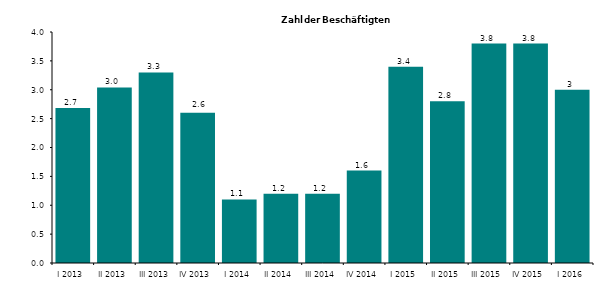
| Category | Series 0 |
|---|---|
| I 2013 | 2.682 |
| II 2013 | 3.039 |
| III 2013 | 3.3 |
| IV 2013 | 2.6 |
| I 2014 | 1.1 |
| II 2014 | 1.2 |
| III 2014 | 1.2 |
| IV 2014 | 1.6 |
| I 2015 | 3.4 |
| II 2015 | 2.8 |
| III 2015 | 3.8 |
| IV 2015 | 3.8 |
| I 2016 | 3 |